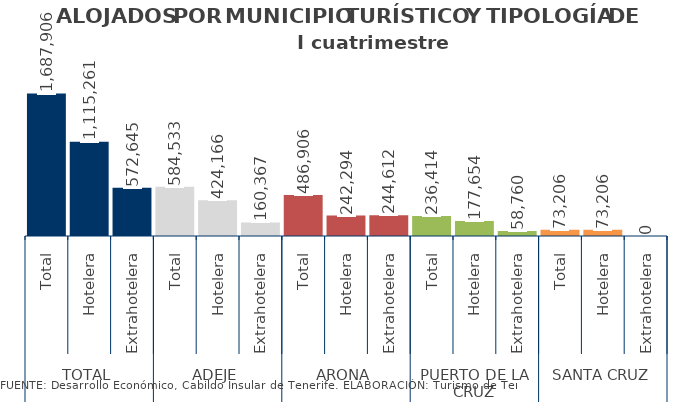
| Category | I cuatrimestre 2014 |
|---|---|
| 0 | 1687906 |
| 1 | 1115261 |
| 2 | 572645 |
| 3 | 584533 |
| 4 | 424166 |
| 5 | 160367 |
| 6 | 486906 |
| 7 | 242294 |
| 8 | 244612 |
| 9 | 236414 |
| 10 | 177654 |
| 11 | 58760 |
| 12 | 73206 |
| 13 | 73206 |
| 14 | 0 |